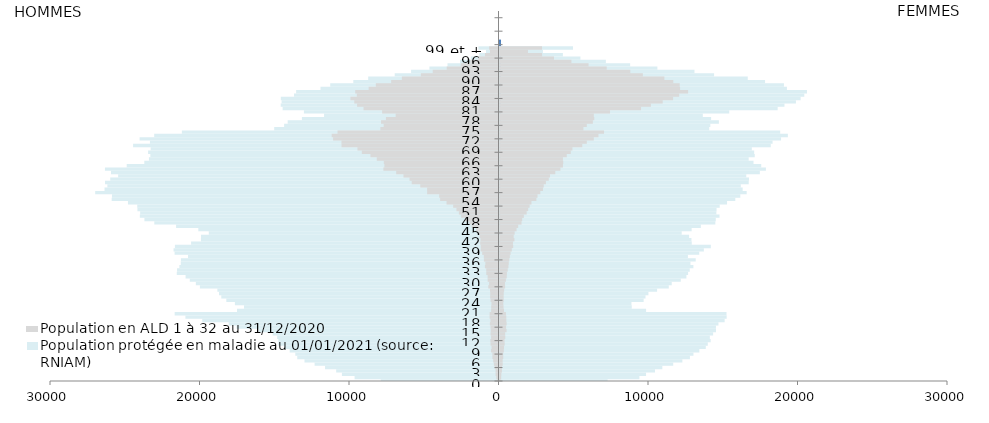
| Category | âge | Femmes RNIAM | Femmes en ALD | Hommes neg RNIAM | Hommes neg ALD |
|---|---|---|---|---|---|
| 0 | 0 | 7230 | 70 | -7872 | -80 |
| 1 | 1 | 9358 | 113 | -9626 | -143 |
| 2 | 2 | 9800 | 122 | -10473 | -195 |
| 3 | 3 | 10401 | 162 | -10857 | -195 |
| 4 | 4 | 10892 | 165 | -11603 | -254 |
| 5 | 5 | 11618 | 212 | -12300 | -307 |
| 6 | 6 | 12231 | 209 | -12976 | -351 |
| 7 | 7 | 12737 | 249 | -13460 | -407 |
| 8 | 8 | 12972 | 244 | -13591 | -408 |
| 9 | 9 | 13367 | 287 | -13964 | -503 |
| 10 | 10 | 13797 | 301 | -14342 | -464 |
| 11 | 11 | 13932 | 343 | -14731 | -533 |
| 12 | 12 | 14125 | 336 | -14723 | -543 |
| 13 | 13 | 14069 | 387 | -14802 | -494 |
| 14 | 14 | 14288 | 377 | -15106 | -532 |
| 15 | 15 | 14479 | 473 | -16036 | -518 |
| 16 | 16 | 14477 | 438 | -17524 | -534 |
| 17 | 17 | 14645 | 475 | -18045 | -576 |
| 18 | 18 | 15059 | 456 | -19816 | -539 |
| 19 | 19 | 15194 | 453 | -20941 | -593 |
| 20 | 20 | 15184 | 430 | -21661 | -592 |
| 21 | 21 | 9804 | 303 | -17489 | -492 |
| 22 | 22 | 8845 | 267 | -17023 | -487 |
| 23 | 23 | 8825 | 255 | -17632 | -470 |
| 24 | 24 | 9641 | 283 | -18205 | -528 |
| 25 | 25 | 9766 | 276 | -18540 | -558 |
| 26 | 26 | 9961 | 281 | -18694 | -552 |
| 27 | 27 | 10540 | 308 | -18802 | -569 |
| 28 | 28 | 11322 | 374 | -19971 | -681 |
| 29 | 29 | 11520 | 365 | -20242 | -628 |
| 30 | 30 | 12126 | 427 | -20648 | -725 |
| 31 | 31 | 12502 | 484 | -20929 | -726 |
| 32 | 32 | 12613 | 493 | -21519 | -817 |
| 33 | 33 | 12726 | 549 | -21500 | -818 |
| 34 | 34 | 12969 | 598 | -21344 | -908 |
| 35 | 35 | 12771 | 619 | -21251 | -878 |
| 36 | 36 | 13124 | 653 | -21242 | -975 |
| 37 | 37 | 12603 | 692 | -20767 | -980 |
| 38 | 38 | 13360 | 740 | -21664 | -1090 |
| 39 | 39 | 13668 | 821 | -21735 | -1193 |
| 40 | 40 | 14136 | 916 | -21644 | -1187 |
| 41 | 41 | 12860 | 900 | -20562 | -1223 |
| 42 | 42 | 12838 | 997 | -19902 | -1205 |
| 43 | 43 | 12681 | 948 | -19897 | -1265 |
| 44 | 44 | 12186 | 1012 | -19377 | -1325 |
| 45 | 45 | 12852 | 1140 | -20078 | -1495 |
| 46 | 46 | 13467 | 1250 | -21565 | -1796 |
| 47 | 47 | 14436 | 1471 | -23022 | -1948 |
| 48 | 48 | 14466 | 1516 | -23683 | -2247 |
| 49 | 49 | 14716 | 1628 | -23990 | -2495 |
| 50 | 50 | 14505 | 1815 | -23968 | -2648 |
| 51 | 51 | 14519 | 1919 | -24150 | -2812 |
| 52 | 52 | 14729 | 2013 | -24163 | -3031 |
| 53 | 53 | 15218 | 2137 | -24783 | -3474 |
| 54 | 54 | 15772 | 2467 | -25874 | -3903 |
| 55 | 55 | 16107 | 2541 | -25853 | -3965 |
| 56 | 56 | 16533 | 2729 | -26976 | -4772 |
| 57 | 57 | 16264 | 2905 | -26351 | -4775 |
| 58 | 58 | 16141 | 2959 | -26161 | -5231 |
| 59 | 59 | 16669 | 3104 | -26318 | -5804 |
| 60 | 60 | 16686 | 3294 | -25969 | -5949 |
| 61 | 61 | 16505 | 3379 | -25441 | -6356 |
| 62 | 62 | 17414 | 3731 | -25919 | -6843 |
| 63 | 63 | 17819 | 4073 | -26324 | -7699 |
| 64 | 64 | 17506 | 4242 | -24868 | -7632 |
| 65 | 65 | 16990 | 4262 | -23691 | -7670 |
| 66 | 66 | 16667 | 4242 | -23381 | -8141 |
| 67 | 67 | 17071 | 4499 | -23287 | -8564 |
| 68 | 68 | 17033 | 4767 | -23437 | -9143 |
| 69 | 69 | 16877 | 4876 | -23267 | -9434 |
| 70 | 70 | 18145 | 5535 | -24442 | -10497 |
| 71 | 71 | 18265 | 5840 | -23314 | -10503 |
| 72 | 72 | 18833 | 6306 | -24004 | -11063 |
| 73 | 73 | 19288 | 6618 | -23030 | -11157 |
| 74 | 74 | 18774 | 6991 | -21178 | -10766 |
| 75 | 75 | 14027 | 5612 | -15002 | -7899 |
| 76 | 76 | 14101 | 5839 | -14339 | -7681 |
| 77 | 77 | 14674 | 6243 | -14100 | -7855 |
| 78 | 78 | 14153 | 6338 | -13148 | -7529 |
| 79 | 79 | 13599 | 6307 | -11668 | -6877 |
| 80 | 80 | 15366 | 7392 | -13014 | -7785 |
| 81 | 81 | 18605 | 9466 | -14438 | -9026 |
| 82 | 82 | 19060 | 10127 | -14567 | -9458 |
| 83 | 83 | 19828 | 10915 | -14506 | -9645 |
| 84 | 84 | 20141 | 11611 | -14560 | -9902 |
| 85 | 85 | 20386 | 12019 | -13676 | -9475 |
| 86 | 86 | 20565 | 12615 | -13536 | -9583 |
| 87 | 87 | 19225 | 12079 | -11906 | -8685 |
| 88 | 88 | 19026 | 12053 | -11255 | -8204 |
| 89 | 89 | 17763 | 11624 | -9711 | -7179 |
| 90 | 90 | 16604 | 11027 | -8716 | -6462 |
| 91 | 91 | 14352 | 9587 | -6941 | -5191 |
| 92 | 92 | 13041 | 8749 | -5847 | -4399 |
| 93 | 93 | 10559 | 7170 | -4619 | -3462 |
| 94 | 94 | 8738 | 5956 | -3410 | -2525 |
| 95 | 95 | 7114 | 4810 | -2568 | -1887 |
| 96 | 96 | 5412 | 3645 | -1849 | -1356 |
| 97 | 97 | 4239 | 2848 | -1284 | -906 |
| 98 | 98 | 2903 | 1904 | -838 | -571 |
| 99 et + | 99 | 4913 | 2845 | -1340 | -625 |